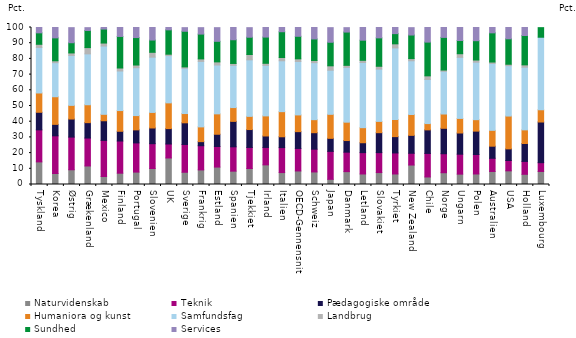
| Category | Naturvidenskab | Teknik | Pædagogiske område | Humaniora og kunst | Samfundsfag | Landbrug | Sundhed | Services |
|---|---|---|---|---|---|---|---|---|
| Tyskland | 14.4 | 20.4 | 11.2 | 12.3 | 29 | 2 | 7.3 | 3.5 |
| Korea | 7 | 24 | 7.3 | 17.6 | 21.7 | 1.2 | 14.6 | 6.7 |
| Østrig | 9.4 | 20.8 | 11.5 | 8.7 | 31.8 | 1.6 | 6.5 | 9.6 |
| Grækenland | 11.8 | 17.8 | 9.8 | 11.4 | 32.4 | 4 | 10.9 | 1.8 |
| Mexico | 5.1 | 23 | 12.5 | 4.1 | 43.5 | 1.9 | 8.9 | 1 |
| Finland | 7.2 | 20.5 | 6.2 | 13.2 | 25.2 | 1.9 | 20.1 | 5.7 |
| Portugal | 7.9 | 18.6 | 8.3 | 9.1 | 30.5 | 1.7 | 17.5 | 6.5 |
| Slovenien | 10.2 | 15.8 | 10 | 9.9 | 35.2 | 3.1 | 7.8 | 8 |
| UK | 16.9 | 8.9 | 9.8 | 16.4 | 30.1 | 0.9 | 15.5 | 1.5 |
| Sverige | 7.8 | 17.7 | 13.8 | 5.9 | 28.9 | 0.8 | 22.7 | 2.3 |
| Frankrig | 9.3 | 15.4 | 2.6 | 9.4 | 41.7 | 1.6 | 15.8 | 4.1 |
| Estland | 11.1 | 13.1 | 7.8 | 13 | 31.1 | 2 | 13.1 | 8.7 |
| Spanien | 8.5 | 15.5 | 16.2 | 8.8 | 26.9 | 1.2 | 15.1 | 7.8 |
| Tjekkiet | 10.2 | 13.4 | 11.4 | 8.4 | 36 | 3.4 | 11 | 6.1 |
| Irland | 12.5 | 11.1 | 7.3 | 12.8 | 32.2 | 1.3 | 16.7 | 6.2 |
| Italien | 7.6 | 15.9 | 6.9 | 16 | 32.4 | 2.1 | 16.4 | 2.8 |
| OECD-Gennensnit | 8.619 | 14.348 | 10.697 | 10.661 | 34.003 | 1.726 | 14.348 | 5.59 |
| Schweiz | 8 | 14.5 | 10.5 | 8.3 | 36.3 | 1.4 | 13.7 | 7.4 |
| Japan | 3.3 | 17.8 | 8.3 | 15.3 | 28.1 | 2.8 | 15 | 9.3 |
| Danmark | 8.2 | 12.4 | 7.4 | 11.7 | 34.9 | 1.3 | 21.2 | 2.8 |
| Letland | 6.7 | 13.6 | 6.3 | 9.6 | 41.5 | 1.4 | 12.8 | 8.1 |
| Slovakiet | 7.6 | 12.7 | 12.7 | 7.2 | 33.3 | 1.8 | 18.1 | 6.6 |
| Tyrkiet | 6.7 | 13.4 | 10.4 | 10.9 | 45.6 | 2.6 | 6.5 | 3.9 |
| New Zealand | 12.4 | 7.5 | 11.4 | 13.3 | 34.2 | 1.4 | 15 | 4.7 |
| Chile | 4.8 | 15 | 15 | 4 | 28.1 | 2.3 | 21.5 | 9.4 |
| Norge | 7.5 | 12.1 | 16.2 | 9.1 | 27.2 | 0.8 | 20.8 | 6.3 |
| Ungarn | 6.6 | 12.7 | 13.5 | 9.3 | 38.9 | 2.3 | 8.4 | 8.3 |
| Polen | 6.7 | 12.4 | 14.9 | 7.3 | 36.6 | 1.4 | 12.3 | 8.5 |
| Australien | 8.3 | 8.4 | 7.7 | 10.1 | 42.6 | 0.9 | 18.6 | 3.4 |
| USA | 8.7 | 6.6 | 7.4 | 20.9 | 32.1 | 0.9 | 16.2 | 7.2 |
| Holland | 6.5 | 8.2 | 11.4 | 8.7 | 39.9 | 1.5 | 18.7 | 5.1 |
| Luxembourg | 8.3 | 5.6 | 25.9 | 7.8 | 46.2 | 0 | 6.1 | 0 |